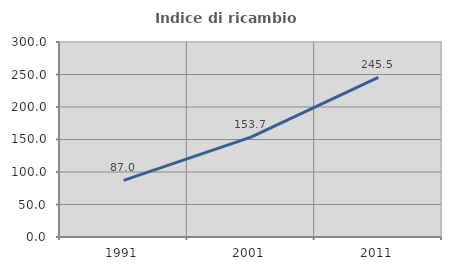
| Category | Indice di ricambio occupazionale  |
|---|---|
| 1991.0 | 87.004 |
| 2001.0 | 153.689 |
| 2011.0 | 245.526 |